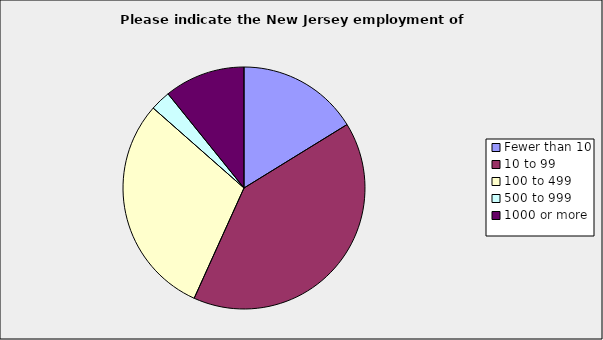
| Category | Series 0 |
|---|---|
| Fewer than 10 | 0.162 |
| 10 to 99 | 0.405 |
| 100 to 499 | 0.297 |
| 500 to 999 | 0.027 |
| 1000 or more | 0.108 |